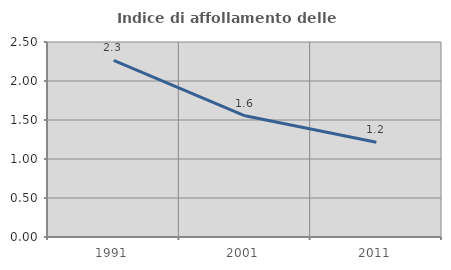
| Category | Indice di affollamento delle abitazioni  |
|---|---|
| 1991.0 | 2.266 |
| 2001.0 | 1.554 |
| 2011.0 | 1.215 |